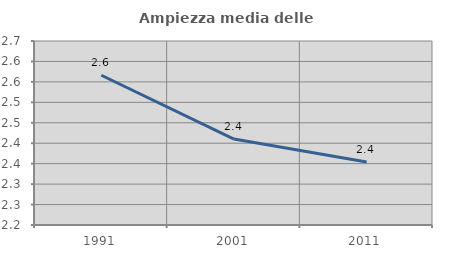
| Category | Ampiezza media delle famiglie |
|---|---|
| 1991.0 | 2.566 |
| 2001.0 | 2.41 |
| 2011.0 | 2.354 |